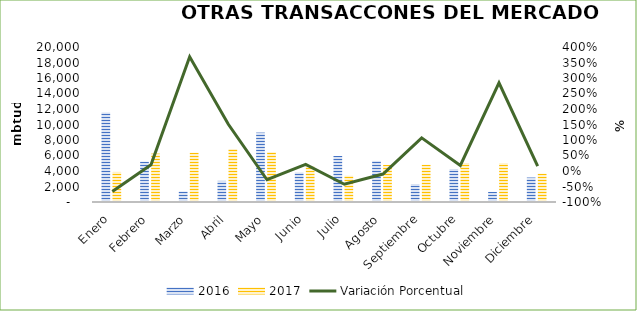
| Category | 2016 | 2017 |
|---|---|---|
| Enero | 11533.182 | 3878.433 |
| Febrero | 5206.053 | 6245.524 |
| Marzo | 1358.208 | 6364.689 |
| Abril | 2727.964 | 6837.534 |
| Mayo | 8957.174 | 6430.08 |
| Junio | 3817.13 | 4638.731 |
| Julio | 5936.938 | 3399.057 |
| Agosto | 5304.726 | 4786.403 |
| Septiembre | 2324.662 | 4809.829 |
| Octubre | 4261.045 | 5028.288 |
| Noviembre | 1303.331 | 5011.908 |
| Diciembre | 3158.961 | 3655.763 |